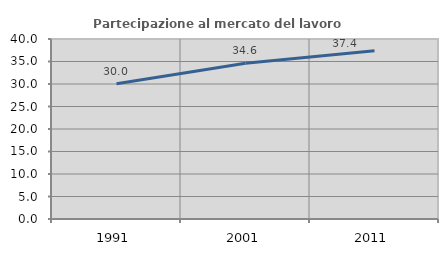
| Category | Partecipazione al mercato del lavoro  femminile |
|---|---|
| 1991.0 | 30.037 |
| 2001.0 | 34.618 |
| 2011.0 | 37.39 |